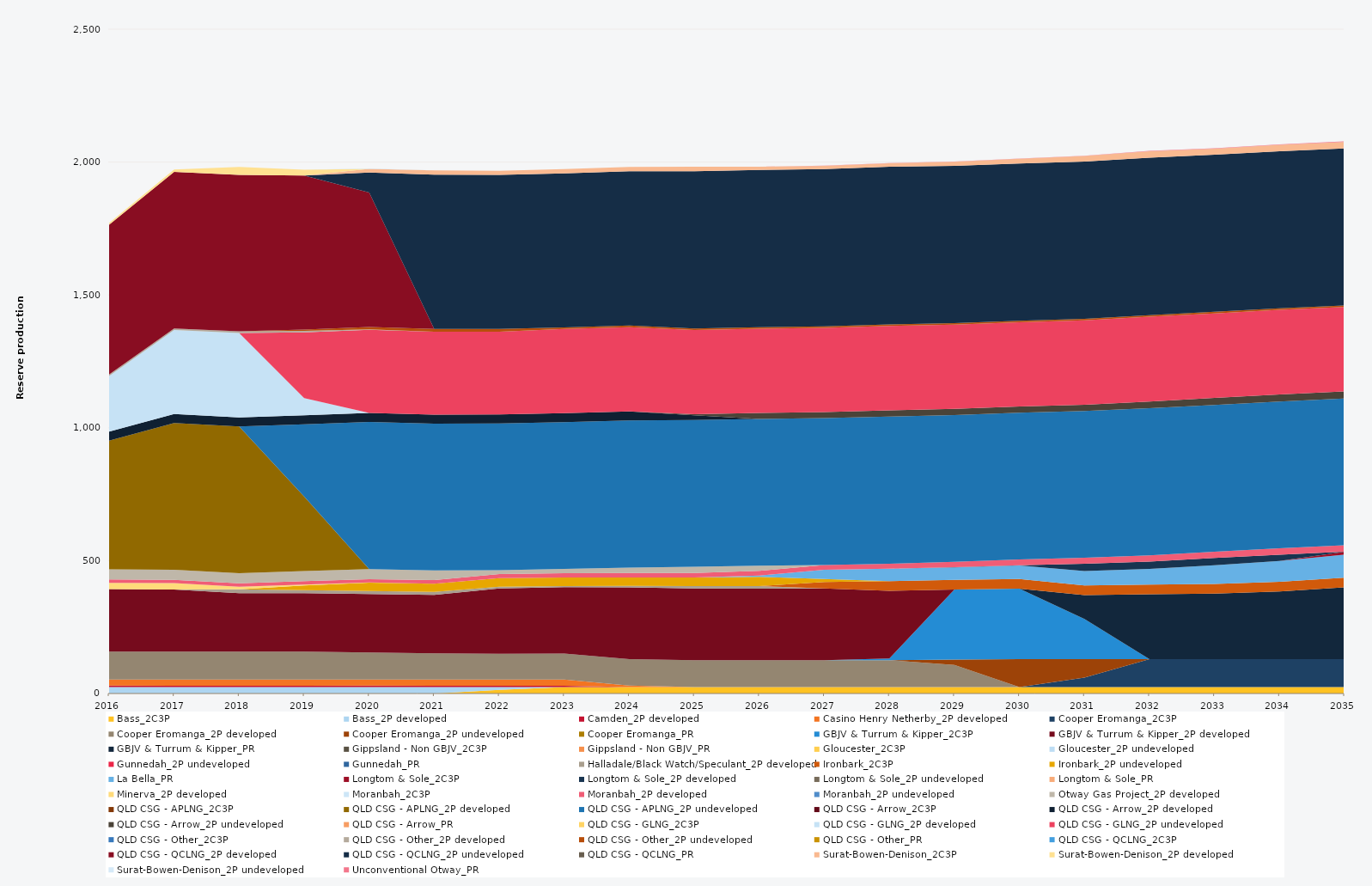
| Category | Bass_2C3P | Bass_2P developed | Camden_2P developed | Casino Henry Netherby_2P developed | Cooper Eromanga_2C3P | Cooper Eromanga_2P developed | Cooper Eromanga_2P undeveloped | Cooper Eromanga_PR | GBJV & Turrum & Kipper_2C3P | GBJV & Turrum & Kipper_2P developed | GBJV & Turrum & Kipper_PR | Gippsland - Non GBJV_2C3P | Gippsland - Non GBJV_PR | Gloucester_2C3P | Gloucester_2P undeveloped | Gunnedah_2P undeveloped | Gunnedah_PR | Halladale/Black Watch/Speculant_2P developed | Ironbark_2C3P | Ironbark_2P undeveloped | La Bella_PR | Longtom & Sole_2C3P | Longtom & Sole_2P developed | Longtom & Sole_2P undeveloped | Longtom & Sole_PR | Minerva_2P developed | Moranbah_2C3P | Moranbah_2P developed | Moranbah_2P undeveloped | Otway Gas Project_2P developed | QLD CSG - APLNG_2C3P | QLD CSG - APLNG_2P developed | QLD CSG - APLNG_2P undeveloped | QLD CSG - Arrow_2C3P | QLD CSG - Arrow_2P developed | QLD CSG - Arrow_2P undeveloped | QLD CSG - Arrow_PR | QLD CSG - GLNG_2C3P | QLD CSG - GLNG_2P developed | QLD CSG - GLNG_2P undeveloped | QLD CSG - Other_2C3P | QLD CSG - Other_2P developed | QLD CSG - Other_2P undeveloped | QLD CSG - Other_PR | QLD CSG - QCLNG_2C3P | QLD CSG - QCLNG_2P developed | QLD CSG - QCLNG_2P undeveloped | QLD CSG - QCLNG_PR | Surat-Bowen-Denison_2C3P | Surat-Bowen-Denison_2P developed | Surat-Bowen-Denison_2P undeveloped | Unconventional Otway_PR |
|---|---|---|---|---|---|---|---|---|---|---|---|---|---|---|---|---|---|---|---|---|---|---|---|---|---|---|---|---|---|---|---|---|---|---|---|---|---|---|---|---|---|---|---|---|---|---|---|---|---|---|---|---|
| 2016 | 0 | 24.522 | 5 | 23.12 | 0 | 105 | 0 | 0 | 0 | 235.041 | 0 | 0 | 0 | 0 | 0 | 0 | 0 | 0 | 0 | 0 | 0 | 0 | 0 | 0 | 0 | 23.79 | 0 | 12.859 | 0 | 38 | 0 | 484.594 | 0 | 0 | 34.038 | 0 | 0 | 0 | 209.001 | 0 | 0 | 5.856 | 0 | 0 | 0 | 563.547 | 0 | 0 | 0 | 5.945 | 0 | 0 |
| 2017 | 0 | 24.455 | 5 | 23.12 | 0 | 105 | 0 | 0 | 0 | 233.892 | 0 | 0 | 0 | 0 | 0 | 0 | 0 | 0 | 0 | 0 | 0 | 0 | 0 | 0 | 0 | 23.725 | 0 | 12.863 | 0 | 38 | 0 | 552.245 | 0 | 0 | 33.945 | 0 | 0 | 0 | 315.709 | 0 | 0 | 5.84 | 0 | 0 | 0 | 589.493 | 0 | 0 | 0 | 9.086 | 0 | 0 |
| 2018 | 0 | 24.455 | 5 | 23.12 | 0 | 105 | 0 | 0 | 0 | 220 | 0 | 0 | 0 | 0 | 0 | 0 | 0 | 14.901 | 0 | 0 | 0 | 0 | 0 | 0 | 0 | 9.422 | 0 | 13.029 | 0 | 38 | 0 | 552.245 | 0 | 0 | 33.945 | 0 | 0 | 0 | 317.904 | 0 | 0 | 5.84 | 0 | 0 | 0 | 588.867 | 0 | 0 | 0 | 30 | 0 | 0 |
| 2019 | 0 | 24.455 | 5 | 23.12 | 0 | 105 | 0 | 0 | 0 | 220 | 0 | 0 | 0 | 0 | 0 | 0 | 0 | 10.95 | 0 | 18.25 | 0 | 0 | 0 | 0 | 0 | 3.339 | 0 | 12.796 | 0 | 38 | 0 | 280.466 | 271.779 | 0 | 33.945 | 0 | 0 | 0 | 64.686 | 247.352 | 0 | 5.84 | 4.563 | 0 | 0 | 579.711 | 0 | 0 | 0 | 21.784 | 0.353 | 0 |
| 2020 | 0 | 24.522 | 5 | 23.12 | 0 | 101.977 | 0 | 0 | 0 | 220 | 0 | 0 | 0 | 0 | 0 | 0 | 0 | 10.95 | 0 | 31.587 | 0 | 0 | 0 | 0 | 0 | 0.475 | 0 | 12.768 | 0 | 38 | 0 | 0 | 553.758 | 0 | 34.038 | 0 | 0 | 0 | 0 | 312.824 | 0 | 1.624 | 8.795 | 0 | 0 | 505.782 | 75.66 | 0 | 13.613 | 0 | 1.647 | 0 |
| 2021 | 0 | 24.455 | 5 | 23.12 | 0 | 98.518 | 0 | 0 | 0 | 220 | 0 | 0 | 0 | 0 | 0 | 0 | 0 | 10.95 | 0 | 31.51 | 0 | 0 | 0 | 0 | 0 | 0 | 0 | 13.526 | 0 | 36.482 | 0 | 0 | 552.245 | 0 | 33.945 | 0 | 0 | 0 | 0 | 311.967 | 0 | 0 | 10.403 | 0 | 0 | 0 | 580.143 | 0 | 16.54 | 0 | 0 | 0 |
| 2022 | 13.672 | 10.783 | 5 | 23.12 | 0 | 96.855 | 0 | 0 | 0 | 245.927 | 0 | 0 | 0 | 0 | 0 | 0 | 0 | 6.747 | 0 | 32.125 | 0 | 0 | 0 | 0 | 0 | 0 | 0 | 15.305 | 0 | 14.195 | 0 | 0 | 552.245 | 0 | 33.945 | 0 | 0 | 0 | 0 | 311.905 | 0 | 0 | 10.403 | 0 | 0 | 0 | 579.646 | 0 | 15.538 | 0 | 0 | 0 |
| 2023 | 24.455 | 0 | 5 | 23.12 | 0 | 97.871 | 0 | 0 | 0 | 249.552 | 0 | 0 | 0 | 0 | 0 | 0 | 0 | 4.165 | 0 | 32.08 | 0 | 0 | 0 | 0 | 0 | 0 | 0 | 16.282 | 0 | 16.401 | 0 | 0 | 552.245 | 0 | 33.945 | 0 | 0 | 0 | 0 | 316.633 | 0 | 0 | 5.84 | 0 | 0 | 0 | 579.627 | 0 | 16.084 | 0 | 0 | 0 |
| 2024 | 24.522 | 0 | 0 | 5.3 | 0 | 99.942 | 0 | 0 | 0 | 270 | 0 | 0 | 0 | 0 | 0 | 0 | 0 | 5.319 | 0 | 31.818 | 0 | 0 | 0 | 0 | 0 | 0 | 0 | 16.806 | 0 | 20.006 | 0 | 0 | 553.758 | 0 | 34.038 | 0 | 0 | 0 | 0 | 317.367 | 0 | 0 | 5.856 | 0 | 0 | 0 | 580.633 | 0 | 16.459 | 0 | 0 | 0 |
| 2025 | 24.455 | 0 | 0 | 0 | 0 | 100.749 | 0 | 0 | 0 | 270 | 0 | 0 | 0 | 0 | 0 | 0 | 0 | 8.848 | 0 | 32.252 | 0 | 0 | 0 | 0 | 0 | 0 | 0 | 17.285 | 0 | 23.306 | 0 | 0 | 552.245 | 0 | 18.166 | 3.911 | 0 | 0 | 0 | 316.806 | 0 | 0 | 5.84 | 0 | 0 | 0 | 591.794 | 0 | 17.198 | 0 | 0 | 0 |
| 2026 | 24.455 | 0 | 0 | 0 | 0 | 100.482 | 0 | 0 | 0 | 270 | 0 | 0 | 0 | 0 | 0 | 0 | 0 | 9.169 | 0 | 35.334 | 4.714 | 0 | 0 | 0 | 0 | 0 | 0 | 17.534 | 0 | 19.216 | 0 | 0 | 552.245 | 0 | 0 | 22.876 | 0 | 0 | 0 | 316.704 | 0 | 0 | 5.84 | 0 | 0 | 0 | 591.753 | 0 | 11.928 | 0 | 0 | 0 |
| 2027 | 24.455 | 0 | 0 | 0 | 0 | 100.567 | 0 | 0 | 0 | 270 | 0 | 0 | 0 | 0 | 0 | 0 | 0 | 0 | 24.671 | 11.044 | 35.007 | 0 | 0 | 0 | 0 | 0 | 0 | 18.159 | 0 | 0 | 0 | 0 | 552.245 | 0 | 0 | 23.167 | 0 | 0 | 0 | 316.867 | 0 | 0 | 5.84 | 0 | 0 | 0 | 591.694 | 0 | 12.145 | 0 | 0 | 0.82 |
| 2028 | 24.522 | 0 | 0 | 0 | 0 | 100.767 | 0 | 0 | 6.395 | 254.696 | 0 | 0 | 0 | 0 | 0 | 0 | 0 | 0 | 36.6 | 0 | 46.441 | 0 | 0 | 0 | 0 | 0 | 0 | 19.008 | 0 | 0 | 0 | 0 | 553.758 | 0 | 0 | 23.513 | 0 | 0 | 0 | 317.838 | 0 | 0 | 5.856 | 0 | 0 | 0 | 593.235 | 0 | 13.041 | 0 | 0 | 0.951 |
| 2029 | 24.455 | 0 | 0 | 0 | 0 | 83.271 | 19.855 | 0 | 263.426 | 0 | 0 | 0 | 0 | 0 | 0 | 0 | 0 | 0 | 36.5 | 0 | 47.125 | 0 | 0.639 | 0 | 0 | 0 | 0 | 20.36 | 0 | 0 | 0 | 0 | 552.245 | 0 | 0 | 23.397 | 0 | 0 | 0 | 316.91 | 0 | 0 | 5.84 | 0 | 0 | 0 | 591.622 | 0 | 15.563 | 0 | 0 | 0.972 |
| 2030 | 24.455 | 0 | 0 | 0 | 0 | 0 | 105 | 0 | 265.134 | 0 | 0 | 0 | 0 | 0 | 0 | 0 | 0 | 0 | 36.5 | 0 | 50.708 | 0 | 0.73 | 0 | 0 | 0 | 0 | 21.622 | 0 | 0 | 0 | 0 | 552.245 | 0 | 0 | 23.644 | 0 | 0 | 0 | 317.293 | 0 | 0 | 5.84 | 0 | 0 | 0 | 591.579 | 0 | 17.913 | 0 | 0 | 0.775 |
| 2031 | 24.455 | 0 | 0 | 0 | 35.273 | 0 | 69.727 | 0 | 150.759 | 0 | 89.756 | 0 | 0 | 0 | 0 | 0 | 0 | 0 | 36.5 | 0 | 54.185 | 0 | 27.375 | 0 | 0 | 0 | 0 | 22.567 | 0 | 0 | 0 | 0 | 552.245 | 0 | 0 | 24.211 | 0 | 0 | 0 | 317.568 | 0 | 0 | 5.84 | 0 | 0 | 0 | 591.53 | 0 | 20.661 | 0 | 0 | 0.816 |
| 2032 | 24.522 | 0 | 0 | 0 | 105 | 0 | 0 | 0 | 0 | 0 | 243.786 | 0 | 0 | 0 | 0 | 0 | 0 | 0 | 36.6 | 0 | 59.276 | 0 | 27.45 | 0 | 0 | 0 | 0 | 23.484 | 0 | 0 | 0 | 0 | 553.758 | 0 | 0 | 25.31 | 0 | 0 | 0 | 318.7 | 0 | 0 | 5.856 | 0 | 0 | 0 | 593.07 | 0 | 23.685 | 0 | 0 | 1.633 |
| 2033 | 24.455 | 0 | 0 | 0 | 105 | 0 | 0 | 0 | 0 | 0 | 246.486 | 0 | 0 | 0 | 0 | 0 | 0 | 0 | 36.5 | 0 | 70.136 | 0 | 27.375 | 0 | 0 | 0 | 0 | 23.992 | 0 | 0 | 0 | 0 | 552.245 | 0 | 0 | 26.325 | 0 | 0 | 0 | 318.169 | 0 | 0 | 5.84 | 0 | 0 | 0 | 591.435 | 0 | 22.62 | 0 | 0 | 1.347 |
| 2034 | 24.455 | 0 | 0 | 0 | 105 | 0 | 0 | 0 | 0 | 0 | 254.774 | 0 | 0 | 0 | 0 | 0 | 0 | 0 | 36.5 | 0 | 78.516 | 0 | 22.914 | 0 | 0 | 0 | 0 | 24.563 | 0 | 0 | 0 | 0 | 552.245 | 0 | 0 | 26.511 | 0 | 0 | 0 | 318.356 | 0 | 0 | 5.84 | 0 | 0 | 0 | 591.394 | 0 | 23.718 | 0 | 0 | 1.435 |
| 2035 | 24.455 | 0 | 0 | 0 | 105 | 0 | 0 | 0 | 0 | 0 | 270 | 0 | 0 | 0 | 0 | 0 | 0 | 0 | 36.5 | 0 | 86.369 | 11.249 | 0 | 0 | 0 | 0 | 0 | 24.813 | 0 | 0 | 0 | 0 | 552.245 | 0 | 0 | 26.426 | 0 | 0 | 0 | 317.84 | 0 | 0 | 5.84 | 0 | 0 | 0 | 591.053 | 0 | 23.995 | 0 | 0 | 2.251 |